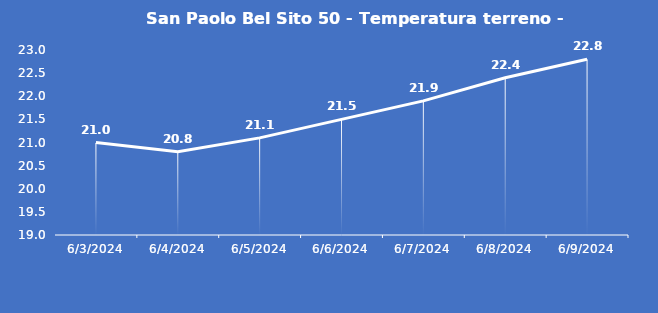
| Category | San Paolo Bel Sito 50 - Temperatura terreno - Grezzo (°C) |
|---|---|
| 6/3/24 | 21 |
| 6/4/24 | 20.8 |
| 6/5/24 | 21.1 |
| 6/6/24 | 21.5 |
| 6/7/24 | 21.9 |
| 6/8/24 | 22.4 |
| 6/9/24 | 22.8 |